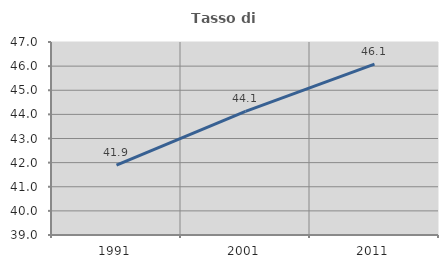
| Category | Tasso di occupazione   |
|---|---|
| 1991.0 | 41.892 |
| 2001.0 | 44.122 |
| 2011.0 | 46.082 |